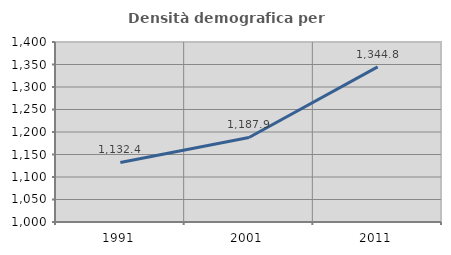
| Category | Densità demografica |
|---|---|
| 1991.0 | 1132.353 |
| 2001.0 | 1187.908 |
| 2011.0 | 1344.771 |